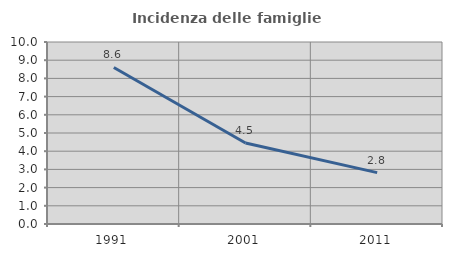
| Category | Incidenza delle famiglie numerose |
|---|---|
| 1991.0 | 8.6 |
| 2001.0 | 4.454 |
| 2011.0 | 2.822 |